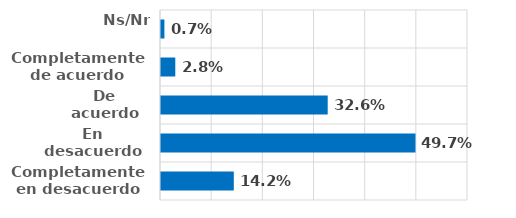
| Category | Series 0 |
|---|---|
| Completamente en desacuerdo | 0.142 |
| En desacuerdo | 0.497 |
| De acuerdo | 0.326 |
| Completamente de acuerdo | 0.028 |
| Ns/Nr | 0.007 |